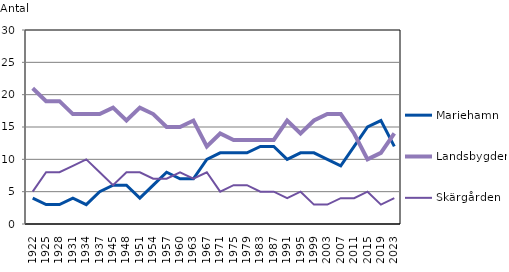
| Category | Mariehamn | Landsbygden | Skärgården |
|---|---|---|---|
| 1922.0 | 4 | 21 | 5 |
| 1925.0 | 3 | 19 | 8 |
| 1928.0 | 3 | 19 | 8 |
| 1931.0 | 4 | 17 | 9 |
| 1934.0 | 3 | 17 | 10 |
| 1937.0 | 5 | 17 | 8 |
| 1945.0 | 6 | 18 | 6 |
| 1948.0 | 6 | 16 | 8 |
| 1951.0 | 4 | 18 | 8 |
| 1954.0 | 6 | 17 | 7 |
| 1957.0 | 8 | 15 | 7 |
| 1960.0 | 7 | 15 | 8 |
| 1963.0 | 7 | 16 | 7 |
| 1967.0 | 10 | 12 | 8 |
| 1971.0 | 11 | 14 | 5 |
| 1975.0 | 11 | 13 | 6 |
| 1979.0 | 11 | 13 | 6 |
| 1983.0 | 12 | 13 | 5 |
| 1987.0 | 12 | 13 | 5 |
| 1991.0 | 10 | 16 | 4 |
| 1995.0 | 11 | 14 | 5 |
| 1999.0 | 11 | 16 | 3 |
| 2003.0 | 10 | 17 | 3 |
| 2007.0 | 9 | 17 | 4 |
| 2011.0 | 12 | 14 | 4 |
| 2015.0 | 15 | 10 | 5 |
| 2019.0 | 16 | 11 | 3 |
| 2023.0 | 12 | 14 | 4 |